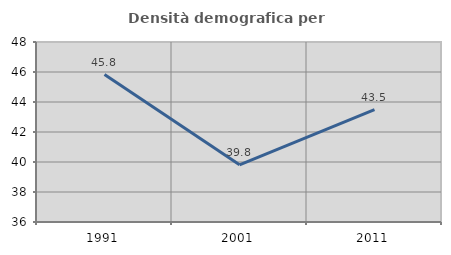
| Category | Densità demografica |
|---|---|
| 1991.0 | 45.83 |
| 2001.0 | 39.809 |
| 2011.0 | 43.497 |